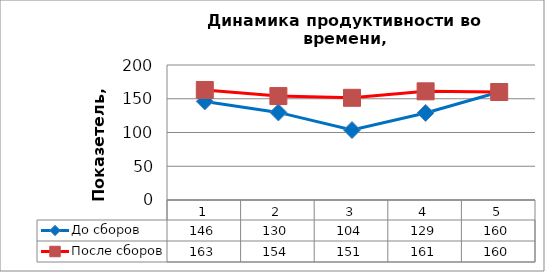
| Category | До сборов | После сборов |
|---|---|---|
| 0 | 146 | 163 |
| 1 | 129.756 | 154 |
| 2 | 103.656 | 151.395 |
| 3 | 129 | 161 |
| 4 | 160 | 160 |